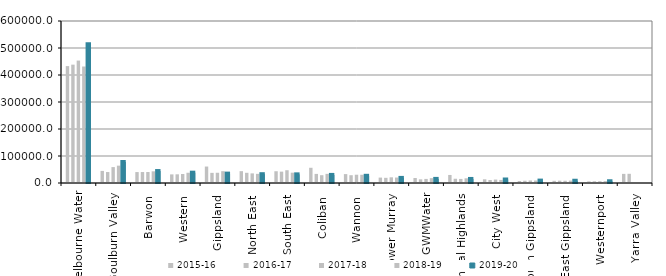
| Category | 2015-16 | 2016-17 | 2017-18 | 2018-19 | 2019-20 |
|---|---|---|---|---|---|
| Melbourne Water | 432997 | 438332 | 453419 | 431455.147 | 513651.425 |
| Goulburn Valley  | 44754 | 40581 | 58908.164 | 64229 | 77754 |
| Barwon  | 40504 | 40603.857 | 40649 | 43237.82 | 44258.933 |
| Western  | 31900 | 32226 | 33282 | 37965 | 38257 |
| Gippsland  | 60964 | 37549 | 37881 | 43725 | 34750 |
| North East  | 43862 | 37737 | 35605 | 33905 | 32613.5 |
| South East  | 43556 | 42098 | 47300 | 38264 | 32006 |
| Coliban  | 56374.4 | 33645 | 28898 | 33856.74 | 29938 |
| Wannon  | 32970 | 28880 | 30674 | 30490 | 26656 |
| Lower Murray  | 20015 | 19162.73 | 21071 | 20206.98 | 18837.9 |
| GWMWater | 18418.8 | 13496.4 | 15112 | 17951.812 | 15168.8 |
| Central Highlands  | 29779 | 15707 | 15075.551 | 17381 | 14976 |
| City West  | 13708 | 11227 | 12718 | 11387 | 12981 |
| South Gippsland  | 7384.915 | 8347.43 | 9248.68 | 9224 | 8874.69 |
| East Gippsland  | 8011.34 | 8556.93 | 8348 | 8872.26 | 8335 |
| Westernport  | 6053 | 6476 | 6637 | 6920 | 6458.8 |
| Yarra Valley  | 33762 | 34083 | 0 | 0 | 0 |